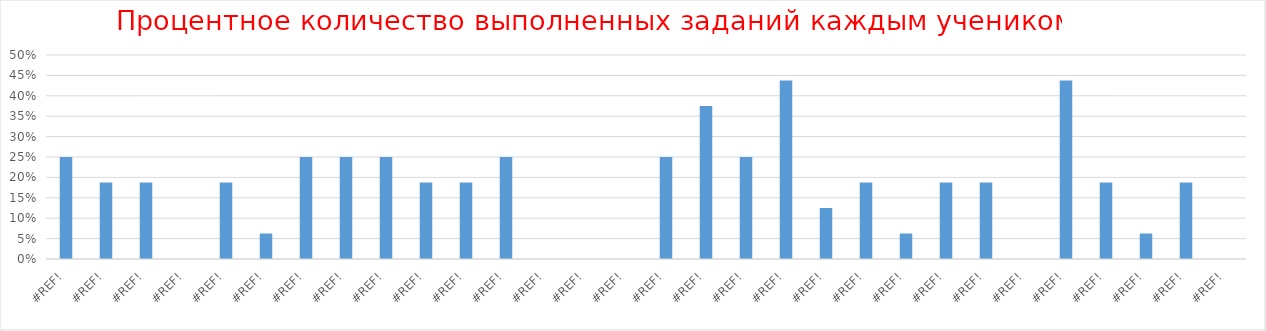
| Category | Series 0 |
|---|---|
| 0.0 | 0.25 |
| 0.0 | 0.188 |
| 0.0 | 0.188 |
| 0.0 | 0 |
| 0.0 | 0.188 |
| 0.0 | 0.062 |
| 0.0 | 0.25 |
| 0.0 | 0.25 |
| 0.0 | 0.25 |
| 0.0 | 0.188 |
| 0.0 | 0.188 |
| 0.0 | 0.25 |
| 0.0 | 0 |
| 0.0 | 0 |
| 0.0 | 0 |
| 0.0 | 0.25 |
| 0.0 | 0.375 |
| 0.0 | 0.25 |
| 0.0 | 0.438 |
| 0.0 | 0.125 |
| 0.0 | 0.188 |
| 0.0 | 0.062 |
| 0.0 | 0.188 |
| 0.0 | 0.188 |
| 0.0 | 0 |
| 0.0 | 0.438 |
| 0.0 | 0.188 |
| 0.0 | 0.062 |
| 0.0 | 0.188 |
| 0.0 | 0 |